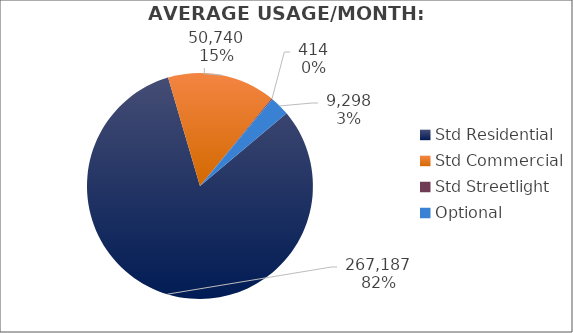
| Category | Usage |
|---|---|
| Std Residential | 267187.333 |
| Std Commercial | 50740 |
| Std Streetlight | 414 |
| Optional | 9298 |